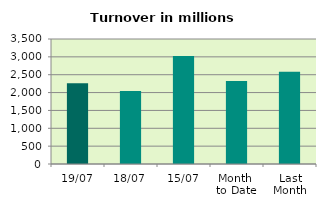
| Category | Series 0 |
|---|---|
| 19/07 | 2263.719 |
| 18/07 | 2042.656 |
| 15/07 | 3024.457 |
| Month 
to Date | 2324.23 |
| Last
Month | 2579.746 |